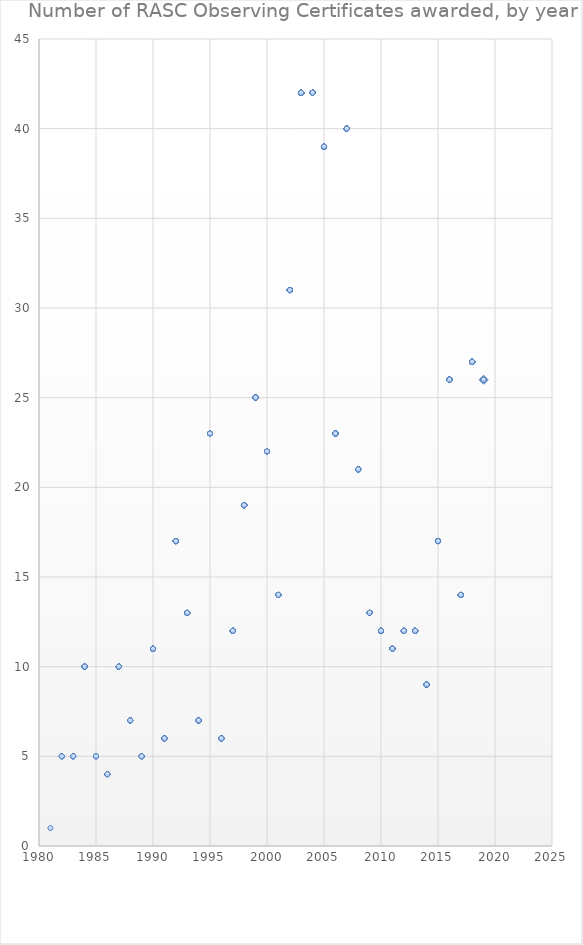
| Category | Series 0 |
|---|---|
| 2019.0 | 26 |
| 2019.0 | 26 |
| 2019.0 | 26 |
| 2019.0 | 26 |
| 2019.0 | 26 |
| 2019.0 | 26 |
| 2019.0 | 26 |
| 2019.0 | 26 |
| 2019.0 | 26 |
| 2018.0 | 27 |
| 2018.0 | 27 |
| 2018.0 | 27 |
| 2018.0 | 27 |
| 2018.0 | 27 |
| 2018.0 | 27 |
| 2018.0 | 27 |
| 2018.0 | 27 |
| 2018.0 | 27 |
| 2018.0 | 27 |
| 2018.0 | 27 |
| 2018.0 | 27 |
| 2018.0 | 27 |
| 2018.0 | 27 |
| 2018.0 | 27 |
| 2018.0 | 27 |
| 2018.0 | 27 |
| 2018.0 | 27 |
| 2018.0 | 27 |
| 2018.0 | 27 |
| 2018.0 | 27 |
| 2018.0 | 27 |
| 2018.0 | 27 |
| 2018.0 | 27 |
| 2018.0 | 27 |
| 2018.0 | 27 |
| 2018.0 | 27 |
| 2017.0 | 14 |
| 2017.0 | 14 |
| 2017.0 | 14 |
| 2017.0 | 14 |
| 2017.0 | 14 |
| 2017.0 | 14 |
| 2017.0 | 14 |
| 2017.0 | 14 |
| 2017.0 | 14 |
| 2017.0 | 14 |
| 2017.0 | 14 |
| 2017.0 | 14 |
| 2017.0 | 14 |
| 2017.0 | 14 |
| 2016.0 | 26 |
| 2016.0 | 26 |
| 2016.0 | 26 |
| 2016.0 | 26 |
| 2016.0 | 26 |
| 2016.0 | 26 |
| 2016.0 | 26 |
| 2016.0 | 26 |
| 2016.0 | 26 |
| 2016.0 | 26 |
| 2016.0 | 26 |
| 2016.0 | 26 |
| 2016.0 | 26 |
| 2016.0 | 26 |
| 2016.0 | 26 |
| 2016.0 | 26 |
| 2016.0 | 26 |
| 2016.0 | 26 |
| 2016.0 | 26 |
| 2016.0 | 26 |
| 2016.0 | 26 |
| 2016.0 | 26 |
| 2016.0 | 26 |
| 2016.0 | 26 |
| 2016.0 | 26 |
| 2016.0 | 26 |
| 2015.0 | 17 |
| 2015.0 | 17 |
| 2015.0 | 17 |
| 2015.0 | 17 |
| 2015.0 | 17 |
| 2015.0 | 17 |
| 2015.0 | 17 |
| 2015.0 | 17 |
| 2015.0 | 17 |
| 2015.0 | 17 |
| 2015.0 | 17 |
| 2015.0 | 17 |
| 2015.0 | 17 |
| 2015.0 | 17 |
| 2015.0 | 17 |
| 2015.0 | 17 |
| 2015.0 | 17 |
| 2014.0 | 9 |
| 2014.0 | 9 |
| 2014.0 | 9 |
| 2014.0 | 9 |
| 2014.0 | 9 |
| 2014.0 | 9 |
| 2014.0 | 9 |
| 2014.0 | 9 |
| 2014.0 | 9 |
| 2013.0 | 12 |
| 2013.0 | 12 |
| 2013.0 | 12 |
| 2013.0 | 12 |
| 2013.0 | 12 |
| 2013.0 | 12 |
| 2013.0 | 12 |
| 2013.0 | 12 |
| 2013.0 | 12 |
| 2013.0 | 12 |
| 2013.0 | 12 |
| 2013.0 | 12 |
| 2012.0 | 12 |
| 2012.0 | 12 |
| 2012.0 | 12 |
| 2012.0 | 12 |
| 2012.0 | 12 |
| 2012.0 | 12 |
| 2012.0 | 12 |
| 2012.0 | 12 |
| 2012.0 | 12 |
| 2012.0 | 12 |
| 2012.0 | 12 |
| 2012.0 | 12 |
| 2011.0 | 11 |
| 2011.0 | 11 |
| 2011.0 | 11 |
| 2011.0 | 11 |
| 2011.0 | 11 |
| 2011.0 | 11 |
| 2011.0 | 11 |
| 2011.0 | 11 |
| 2011.0 | 11 |
| 2011.0 | 11 |
| 2011.0 | 11 |
| 2010.0 | 12 |
| 2010.0 | 12 |
| 2010.0 | 12 |
| 2010.0 | 12 |
| 2010.0 | 12 |
| 2010.0 | 12 |
| 2010.0 | 12 |
| 2010.0 | 12 |
| 2010.0 | 12 |
| 2010.0 | 12 |
| 2010.0 | 12 |
| 2010.0 | 12 |
| 2009.0 | 13 |
| 2009.0 | 13 |
| 2009.0 | 13 |
| 2009.0 | 13 |
| 2009.0 | 13 |
| 2009.0 | 13 |
| 2009.0 | 13 |
| 2009.0 | 13 |
| 2009.0 | 13 |
| 2009.0 | 13 |
| 2009.0 | 13 |
| 2009.0 | 13 |
| 2009.0 | 13 |
| 2008.0 | 21 |
| 2008.0 | 21 |
| 2008.0 | 21 |
| 2008.0 | 21 |
| 2008.0 | 21 |
| 2008.0 | 21 |
| 2008.0 | 21 |
| 2008.0 | 21 |
| 2008.0 | 21 |
| 2008.0 | 21 |
| 2008.0 | 21 |
| 2008.0 | 21 |
| 2008.0 | 21 |
| 2008.0 | 21 |
| 2008.0 | 21 |
| 2008.0 | 21 |
| 2008.0 | 21 |
| 2008.0 | 21 |
| 2008.0 | 21 |
| 2008.0 | 21 |
| 2008.0 | 21 |
| 2007.0 | 40 |
| 2007.0 | 40 |
| 2007.0 | 40 |
| 2007.0 | 40 |
| 2007.0 | 40 |
| 2007.0 | 40 |
| 2007.0 | 40 |
| 2007.0 | 40 |
| 2007.0 | 40 |
| 2007.0 | 40 |
| 2007.0 | 40 |
| 2007.0 | 40 |
| 2007.0 | 40 |
| 2007.0 | 40 |
| 2007.0 | 40 |
| 2007.0 | 40 |
| 2007.0 | 40 |
| 2007.0 | 40 |
| 2007.0 | 40 |
| 2007.0 | 40 |
| 2007.0 | 40 |
| 2007.0 | 40 |
| 2007.0 | 40 |
| 2007.0 | 40 |
| 2007.0 | 40 |
| 2007.0 | 40 |
| 2007.0 | 40 |
| 2007.0 | 40 |
| 2007.0 | 40 |
| 2007.0 | 40 |
| 2007.0 | 40 |
| 2007.0 | 40 |
| 2007.0 | 40 |
| 2007.0 | 40 |
| 2007.0 | 40 |
| 2007.0 | 40 |
| 2007.0 | 40 |
| 2007.0 | 40 |
| 2007.0 | 40 |
| 2007.0 | 40 |
| 2006.0 | 23 |
| 2006.0 | 23 |
| 2006.0 | 23 |
| 2006.0 | 23 |
| 2006.0 | 23 |
| 2006.0 | 23 |
| 2006.0 | 23 |
| 2006.0 | 23 |
| 2006.0 | 23 |
| 2006.0 | 23 |
| 2006.0 | 23 |
| 2006.0 | 23 |
| 2006.0 | 23 |
| 2006.0 | 23 |
| 2006.0 | 23 |
| 2006.0 | 23 |
| 2006.0 | 23 |
| 2006.0 | 23 |
| 2006.0 | 23 |
| 2006.0 | 23 |
| 2006.0 | 23 |
| 2006.0 | 23 |
| 2006.0 | 23 |
| 2005.0 | 39 |
| 2005.0 | 39 |
| 2005.0 | 39 |
| 2005.0 | 39 |
| 2005.0 | 39 |
| 2005.0 | 39 |
| 2005.0 | 39 |
| 2005.0 | 39 |
| 2005.0 | 39 |
| 2005.0 | 39 |
| 2005.0 | 39 |
| 2005.0 | 39 |
| 2005.0 | 39 |
| 2005.0 | 39 |
| 2005.0 | 39 |
| 2005.0 | 39 |
| 2005.0 | 39 |
| 2005.0 | 39 |
| 2005.0 | 39 |
| 2005.0 | 39 |
| 2005.0 | 39 |
| 2005.0 | 39 |
| 2005.0 | 39 |
| 2005.0 | 39 |
| 2005.0 | 39 |
| 2005.0 | 39 |
| 2005.0 | 39 |
| 2005.0 | 39 |
| 2005.0 | 39 |
| 2005.0 | 39 |
| 2005.0 | 39 |
| 2005.0 | 39 |
| 2005.0 | 39 |
| 2005.0 | 39 |
| 2005.0 | 39 |
| 2005.0 | 39 |
| 2005.0 | 39 |
| 2005.0 | 39 |
| 2005.0 | 39 |
| 2004.0 | 42 |
| 2004.0 | 42 |
| 2004.0 | 42 |
| 2004.0 | 42 |
| 2004.0 | 42 |
| 2004.0 | 42 |
| 2004.0 | 42 |
| 2004.0 | 42 |
| 2004.0 | 42 |
| 2004.0 | 42 |
| 2004.0 | 42 |
| 2004.0 | 42 |
| 2004.0 | 42 |
| 2004.0 | 42 |
| 2004.0 | 42 |
| 2004.0 | 42 |
| 2004.0 | 42 |
| 2004.0 | 42 |
| 2004.0 | 42 |
| 2004.0 | 42 |
| 2004.0 | 42 |
| 2004.0 | 42 |
| 2004.0 | 42 |
| 2004.0 | 42 |
| 2004.0 | 42 |
| 2004.0 | 42 |
| 2004.0 | 42 |
| 2004.0 | 42 |
| 2004.0 | 42 |
| 2004.0 | 42 |
| 2004.0 | 42 |
| 2004.0 | 42 |
| 2004.0 | 42 |
| 2004.0 | 42 |
| 2004.0 | 42 |
| 2004.0 | 42 |
| 2004.0 | 42 |
| 2004.0 | 42 |
| 2004.0 | 42 |
| 2004.0 | 42 |
| 2004.0 | 42 |
| 2004.0 | 42 |
| 2003.0 | 42 |
| 2003.0 | 42 |
| 2003.0 | 42 |
| 2003.0 | 42 |
| 2003.0 | 42 |
| 2003.0 | 42 |
| 2003.0 | 42 |
| 2003.0 | 42 |
| 2003.0 | 42 |
| 2003.0 | 42 |
| 2003.0 | 42 |
| 2003.0 | 42 |
| 2003.0 | 42 |
| 2003.0 | 42 |
| 2003.0 | 42 |
| 2003.0 | 42 |
| 2003.0 | 42 |
| 2003.0 | 42 |
| 2003.0 | 42 |
| 2003.0 | 42 |
| 2003.0 | 42 |
| 2003.0 | 42 |
| 2003.0 | 42 |
| 2003.0 | 42 |
| 2003.0 | 42 |
| 2003.0 | 42 |
| 2003.0 | 42 |
| 2003.0 | 42 |
| 2003.0 | 42 |
| 2003.0 | 42 |
| 2003.0 | 42 |
| 2003.0 | 42 |
| 2003.0 | 42 |
| 2003.0 | 42 |
| 2003.0 | 42 |
| 2003.0 | 42 |
| 2003.0 | 42 |
| 2003.0 | 42 |
| 2003.0 | 42 |
| 2003.0 | 42 |
| 2003.0 | 42 |
| 2003.0 | 42 |
| 2002.0 | 31 |
| 2002.0 | 31 |
| 2002.0 | 31 |
| 2002.0 | 31 |
| 2002.0 | 31 |
| 2002.0 | 31 |
| 2002.0 | 31 |
| 2002.0 | 31 |
| 2002.0 | 31 |
| 2002.0 | 31 |
| 2002.0 | 31 |
| 2002.0 | 31 |
| 2002.0 | 31 |
| 2002.0 | 31 |
| 2002.0 | 31 |
| 2002.0 | 31 |
| 2002.0 | 31 |
| 2002.0 | 31 |
| 2002.0 | 31 |
| 2002.0 | 31 |
| 2002.0 | 31 |
| 2002.0 | 31 |
| 2002.0 | 31 |
| 2002.0 | 31 |
| 2002.0 | 31 |
| 2002.0 | 31 |
| 2002.0 | 31 |
| 2002.0 | 31 |
| 2002.0 | 31 |
| 2002.0 | 31 |
| 2002.0 | 31 |
| 2001.0 | 14 |
| 2001.0 | 14 |
| 2001.0 | 14 |
| 2001.0 | 14 |
| 2001.0 | 14 |
| 2001.0 | 14 |
| 2001.0 | 14 |
| 2001.0 | 14 |
| 2001.0 | 14 |
| 2001.0 | 14 |
| 2001.0 | 14 |
| 2001.0 | 14 |
| 2001.0 | 14 |
| 2001.0 | 14 |
| 2000.0 | 22 |
| 2000.0 | 22 |
| 2000.0 | 22 |
| 2000.0 | 22 |
| 2000.0 | 22 |
| 2000.0 | 22 |
| 2000.0 | 22 |
| 2000.0 | 22 |
| 2000.0 | 22 |
| 2000.0 | 22 |
| 2000.0 | 22 |
| 2000.0 | 22 |
| 2000.0 | 22 |
| 2000.0 | 22 |
| 2000.0 | 22 |
| 2000.0 | 22 |
| 2000.0 | 22 |
| 2000.0 | 22 |
| 2000.0 | 22 |
| 2000.0 | 22 |
| 2000.0 | 22 |
| 2000.0 | 22 |
| 1999.0 | 25 |
| 1999.0 | 25 |
| 1999.0 | 25 |
| 1999.0 | 25 |
| 1999.0 | 25 |
| 1999.0 | 25 |
| 1999.0 | 25 |
| 1999.0 | 25 |
| 1999.0 | 25 |
| 1999.0 | 25 |
| 1999.0 | 25 |
| 1999.0 | 25 |
| 1999.0 | 25 |
| 1999.0 | 25 |
| 1999.0 | 25 |
| 1999.0 | 25 |
| 1999.0 | 25 |
| 1999.0 | 25 |
| 1999.0 | 25 |
| 1999.0 | 25 |
| 1999.0 | 25 |
| 1999.0 | 25 |
| 1999.0 | 25 |
| 1999.0 | 25 |
| 1999.0 | 25 |
| 1998.0 | 19 |
| 1998.0 | 19 |
| 1998.0 | 19 |
| 1998.0 | 19 |
| 1998.0 | 19 |
| 1998.0 | 19 |
| 1998.0 | 19 |
| 1998.0 | 19 |
| 1998.0 | 19 |
| 1998.0 | 19 |
| 1998.0 | 19 |
| 1998.0 | 19 |
| 1998.0 | 19 |
| 1998.0 | 19 |
| 1998.0 | 19 |
| 1998.0 | 19 |
| 1998.0 | 19 |
| 1998.0 | 19 |
| 1998.0 | 19 |
| 1997.0 | 12 |
| 1997.0 | 12 |
| 1997.0 | 12 |
| 1997.0 | 12 |
| 1997.0 | 12 |
| 1997.0 | 12 |
| 1997.0 | 12 |
| 1997.0 | 12 |
| 1997.0 | 12 |
| 1997.0 | 12 |
| 1997.0 | 12 |
| 1997.0 | 12 |
| 1996.0 | 6 |
| 1996.0 | 6 |
| 1996.0 | 6 |
| 1996.0 | 6 |
| 1996.0 | 6 |
| 1996.0 | 6 |
| 1995.0 | 23 |
| 1995.0 | 23 |
| 1995.0 | 23 |
| 1995.0 | 23 |
| 1995.0 | 23 |
| 1995.0 | 23 |
| 1995.0 | 23 |
| 1995.0 | 23 |
| 1995.0 | 23 |
| 1995.0 | 23 |
| 1995.0 | 23 |
| 1995.0 | 23 |
| 1995.0 | 23 |
| 1995.0 | 23 |
| 1995.0 | 23 |
| 1995.0 | 23 |
| 1995.0 | 23 |
| 1995.0 | 23 |
| 1995.0 | 23 |
| 1995.0 | 23 |
| 1995.0 | 23 |
| 1995.0 | 23 |
| 1995.0 | 23 |
| 1994.0 | 7 |
| 1994.0 | 7 |
| 1994.0 | 7 |
| 1994.0 | 7 |
| 1994.0 | 7 |
| 1994.0 | 7 |
| 1994.0 | 7 |
| 1993.0 | 13 |
| 1993.0 | 13 |
| 1993.0 | 13 |
| 1993.0 | 13 |
| 1993.0 | 13 |
| 1993.0 | 13 |
| 1993.0 | 13 |
| 1993.0 | 13 |
| 1993.0 | 13 |
| 1993.0 | 13 |
| 1993.0 | 13 |
| 1993.0 | 13 |
| 1993.0 | 13 |
| 1992.0 | 17 |
| 1992.0 | 17 |
| 1992.0 | 17 |
| 1992.0 | 17 |
| 1992.0 | 17 |
| 1992.0 | 17 |
| 1992.0 | 17 |
| 1992.0 | 17 |
| 1992.0 | 17 |
| 1992.0 | 17 |
| 1992.0 | 17 |
| 1992.0 | 17 |
| 1992.0 | 17 |
| 1992.0 | 17 |
| 1992.0 | 17 |
| 1992.0 | 17 |
| 1992.0 | 17 |
| 1991.0 | 6 |
| 1991.0 | 6 |
| 1991.0 | 6 |
| 1991.0 | 6 |
| 1991.0 | 6 |
| 1991.0 | 6 |
| 1990.0 | 11 |
| 1990.0 | 11 |
| 1990.0 | 11 |
| 1990.0 | 11 |
| 1990.0 | 11 |
| 1990.0 | 11 |
| 1990.0 | 11 |
| 1990.0 | 11 |
| 1990.0 | 11 |
| 1990.0 | 11 |
| 1990.0 | 11 |
| 1989.0 | 5 |
| 1989.0 | 5 |
| 1989.0 | 5 |
| 1989.0 | 5 |
| 1989.0 | 5 |
| 1988.0 | 7 |
| 1988.0 | 7 |
| 1988.0 | 7 |
| 1988.0 | 7 |
| 1988.0 | 7 |
| 1988.0 | 7 |
| 1988.0 | 7 |
| 1987.0 | 10 |
| 1987.0 | 10 |
| 1987.0 | 10 |
| 1987.0 | 10 |
| 1987.0 | 10 |
| 1987.0 | 10 |
| 1987.0 | 10 |
| 1987.0 | 10 |
| 1987.0 | 10 |
| 1987.0 | 10 |
| 1986.0 | 4 |
| 1986.0 | 4 |
| 1986.0 | 4 |
| 1986.0 | 4 |
| 1985.0 | 5 |
| 1985.0 | 5 |
| 1985.0 | 5 |
| 1985.0 | 5 |
| 1985.0 | 5 |
| 1984.0 | 10 |
| 1984.0 | 10 |
| 1984.0 | 10 |
| 1984.0 | 10 |
| 1984.0 | 10 |
| 1984.0 | 10 |
| 1984.0 | 10 |
| 1984.0 | 10 |
| 1984.0 | 10 |
| 1984.0 | 10 |
| 1983.0 | 5 |
| 1983.0 | 5 |
| 1983.0 | 5 |
| 1983.0 | 5 |
| 1983.0 | 5 |
| 1982.0 | 5 |
| 1982.0 | 5 |
| 1982.0 | 5 |
| 1982.0 | 5 |
| 1982.0 | 5 |
| 1981.0 | 1 |